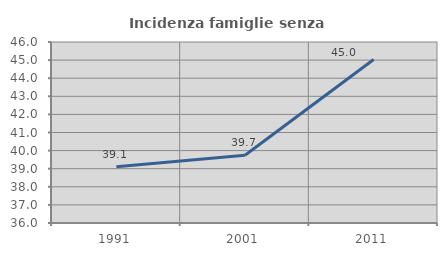
| Category | Incidenza famiglie senza nuclei |
|---|---|
| 1991.0 | 39.109 |
| 2001.0 | 39.746 |
| 2011.0 | 45.029 |